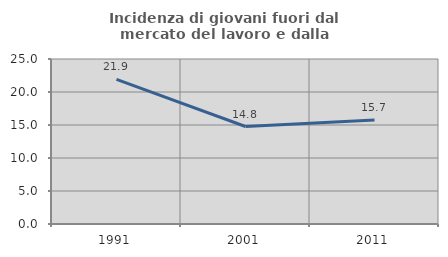
| Category | Incidenza di giovani fuori dal mercato del lavoro e dalla formazione  |
|---|---|
| 1991.0 | 21.924 |
| 2001.0 | 14.771 |
| 2011.0 | 15.745 |